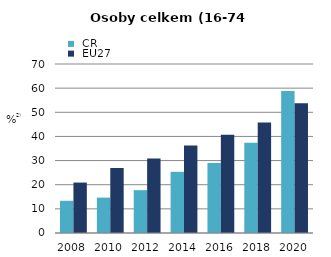
| Category |  ČR |  EU27 |
|---|---|---|
| 2008.0 | 13.345 | 20.895 |
| 2010.0 | 14.657 | 26.943 |
| 2012.0 | 17.744 | 30.9 |
| 2014.0 | 25.343 | 36.2 |
| 2016.0 | 28.999 | 40.7 |
| 2018.0 | 37.362 | 45.8 |
| 2020.0 | 58.8 | 53.76 |